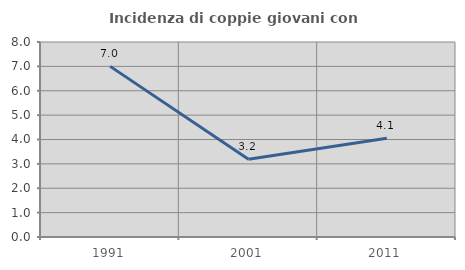
| Category | Incidenza di coppie giovani con figli |
|---|---|
| 1991.0 | 7 |
| 2001.0 | 3.191 |
| 2011.0 | 4.054 |